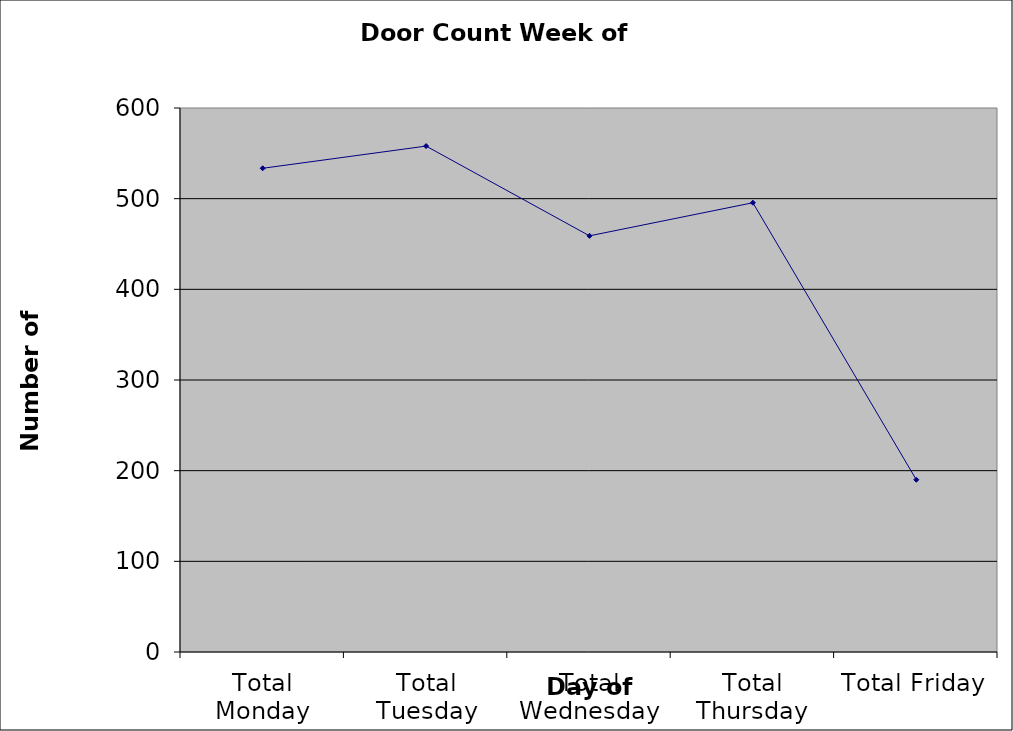
| Category | Series 0 |
|---|---|
| Total Monday | 533.5 |
| Total Tuesday | 558 |
| Total Wednesday | 459 |
| Total Thursday | 495.5 |
| Total Friday | 190 |